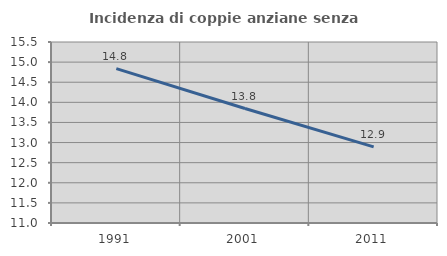
| Category | Incidenza di coppie anziane senza figli  |
|---|---|
| 1991.0 | 14.837 |
| 2001.0 | 13.846 |
| 2011.0 | 12.893 |